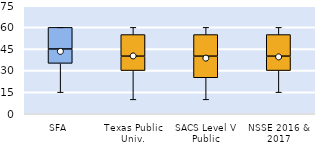
| Category | 25th | 50th | 75th |
|---|---|---|---|
| SFA | 35 | 10 | 15 |
| Texas Public Univ. | 30 | 10 | 15 |
| SACS Level V Public | 25 | 15 | 15 |
| NSSE 2016 & 2017 | 30 | 10 | 15 |